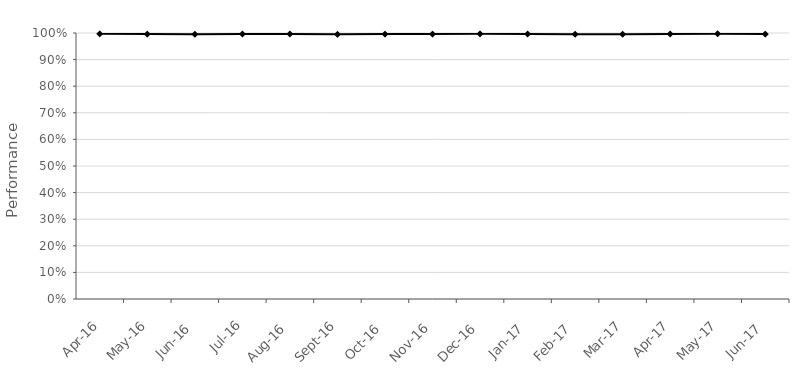
| Category | NPS SL001 |
|---|---|
| 2016-04-01 | 0.997 |
| 2016-05-01 | 0.996 |
| 2016-06-01 | 0.995 |
| 2016-07-01 | 0.996 |
| 2016-08-01 | 0.996 |
| 2016-09-01 | 0.995 |
| 2016-10-01 | 0.996 |
| 2016-11-01 | 0.996 |
| 2016-12-01 | 0.997 |
| 2017-01-01 | 0.996 |
| 2017-02-01 | 0.995 |
| 2017-03-01 | 0.995 |
| 2017-04-01 | 0.996 |
| 2017-05-01 | 0.997 |
| 2017-06-01 | 0.996 |